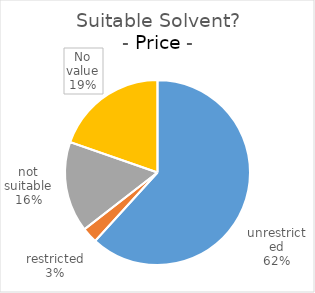
| Category | Series 0 |
|---|---|
| 0 | 113 |
| 1 | 5 |
| 2 | 29 |
| 3 | 36 |